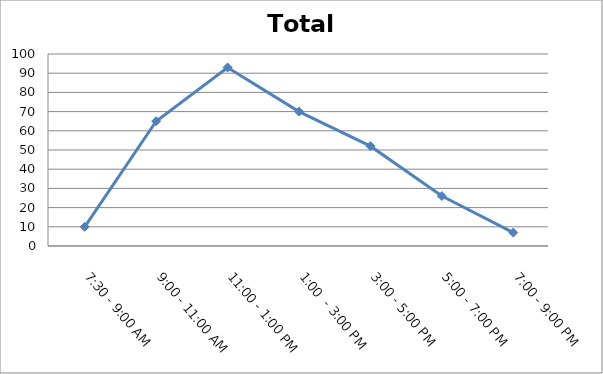
| Category | Total |
|---|---|
| 7:30 - 9:00 AM | 10 |
| 9:00 - 11:00 AM | 65 |
| 11:00 - 1:00 PM | 93 |
| 1:00  - 3:00 PM | 70 |
| 3:00 - 5:00 PM | 52 |
| 5:00 - 7:00 PM | 26 |
| 7:00 - 9:00 PM | 7 |